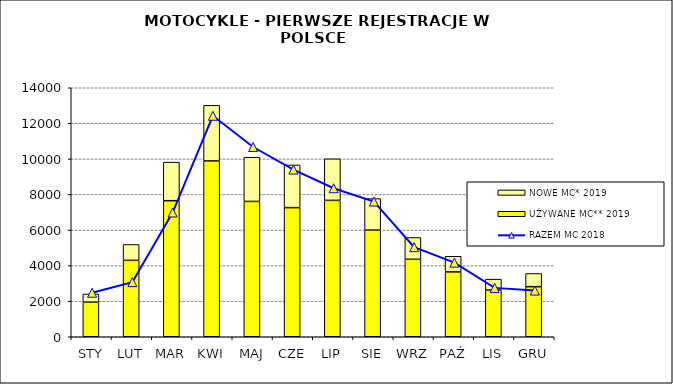
| Category | UŻYWANE MC** 2019 | NOWE MC* 2019 |
|---|---|---|
| STY | 1947 | 460 |
| LUT | 4296 | 893 |
| MAR | 7650 | 2168 |
| KWI | 9885 | 3126 |
| MAJ | 7608 | 2483 |
| CZE | 7260 | 2401 |
| LIP | 7667 | 2338 |
| SIE | 5996 | 1771 |
| WRZ | 4356 | 1224 |
| PAŹ | 3645 | 881 |
| LIS | 2623 | 617 |
| GRU | 2816 | 741 |